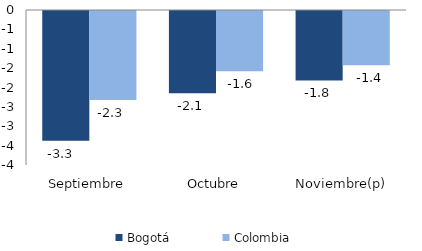
| Category | Bogotá | Colombia |
|---|---|---|
| Septiembre | -3.349 | -2.299 |
| Octubre | -2.125 | -1.552 |
| Noviembre(p) | -1.792 | -1.4 |